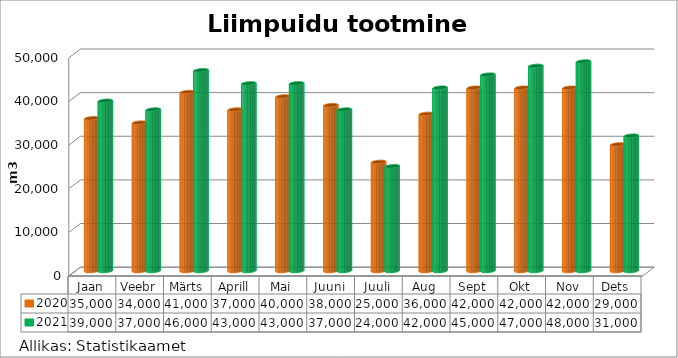
| Category | 2020 | 2021 |
|---|---|---|
| Jaan | 35000 | 39000 |
| Veebr | 34000 | 37000 |
| Märts | 41000 | 46000 |
| Aprill | 37000 | 43000 |
| Mai | 40000 | 43000 |
| Juuni | 38000 | 37000 |
| Juuli | 25000 | 24000 |
| Aug | 36000 | 42000 |
| Sept | 42000 | 45000 |
| Okt | 42000 | 47000 |
| Nov | 42000 | 48000 |
| Dets | 29000 | 31000 |